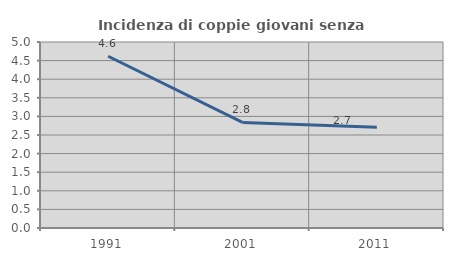
| Category | Incidenza di coppie giovani senza figli |
|---|---|
| 1991.0 | 4.616 |
| 2001.0 | 2.837 |
| 2011.0 | 2.706 |